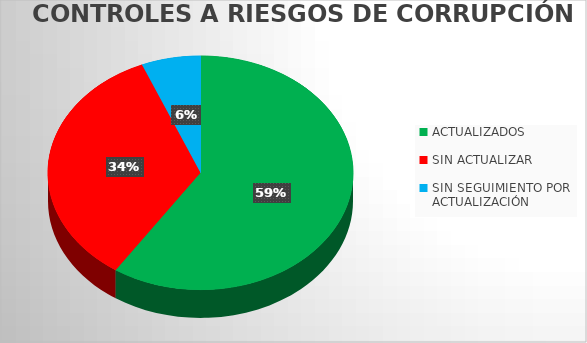
| Category | Series 0 |
|---|---|
| ACTUALIZADOS | 19 |
| SIN ACTUALIZAR | 11 |
| SIN SEGUIMIENTO POR ACTUALIZACIÓN | 2 |